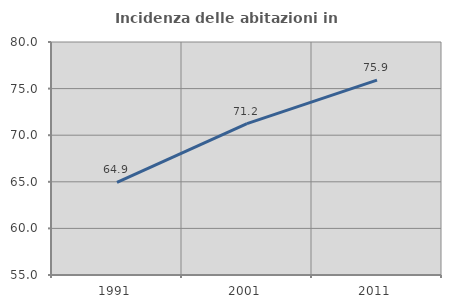
| Category | Incidenza delle abitazioni in proprietà  |
|---|---|
| 1991.0 | 64.934 |
| 2001.0 | 71.24 |
| 2011.0 | 75.913 |